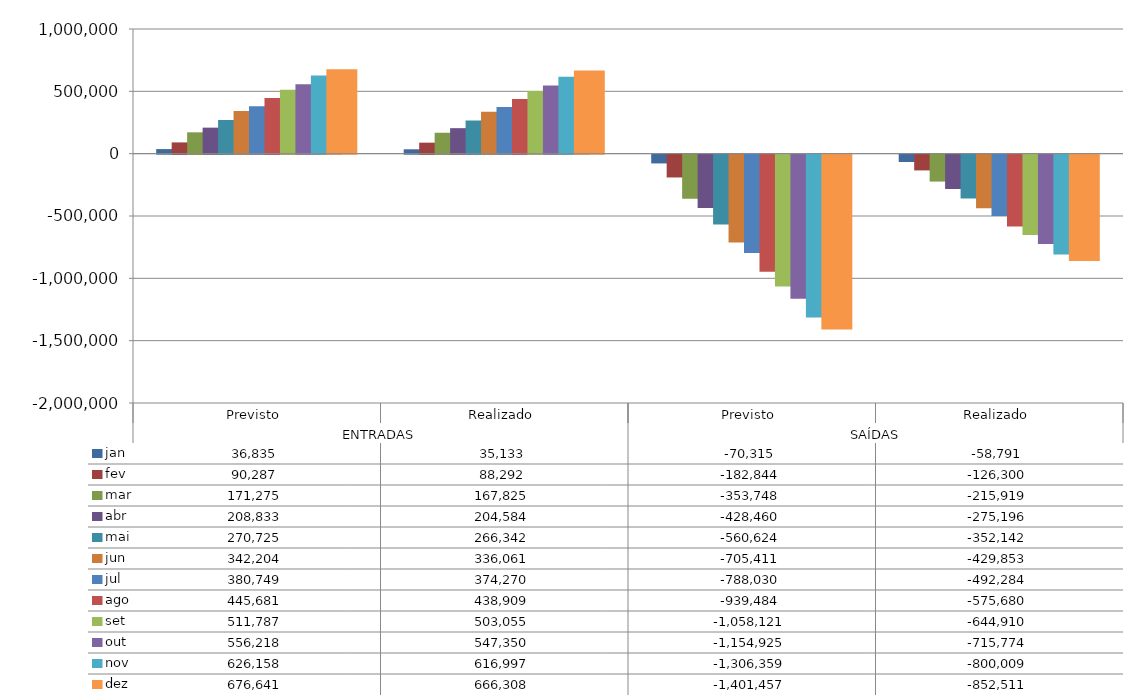
| Category | jan | fev | mar | abr | mai | jun | jul | ago | set | out | nov | dez |
|---|---|---|---|---|---|---|---|---|---|---|---|---|
| 0 | 36835.17 | 90287.4 | 171275.43 | 208832.62 | 270725.2 | 342203.97 | 380749.23 | 445681.41 | 511787.02 | 556217.73 | 626158.14 | 676640.76 |
| 1 | 35133.49 | 88292.28 | 167824.67 | 204584.3 | 266341.52 | 336060.53 | 374270.43 | 438909.17 | 503055.02 | 547350.37 | 616997.34 | 666308.16 |
| 2 | -70315 | -182844 | -353748 | -428460 | -560624 | -705411 | -788030 | -939484 | -1058121 | -1154925 | -1306359 | -1401457 |
| 3 | -58790.678 | -126300.06 | -215918.992 | -275196.184 | -352142.316 | -429852.984 | -492283.672 | -575680.498 | -644909.526 | -715773.76 | -800008.732 | -852510.968 |